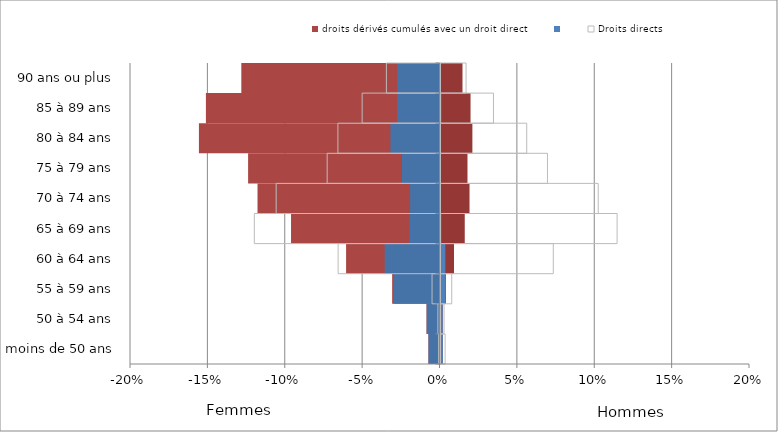
| Category | droits dérivés cumulés avec un droit direct | Series 3 | Series 2 | Droits dérivés servis seuls | Series 5 | Droits directs |
|---|---|---|---|---|---|---|
|  moins de 50 ans | -0.007 | 0.002 | 0.002 | -0.007 | 0.003 | -0.001 |
|  50 à 54 ans | -0.008 | 0.001 | 0.001 | -0.008 | 0.002 | -0.001 |
|  55 à 59 ans | -0.031 | 0.004 | 0.003 | -0.03 | 0.007 | -0.005 |
|  60 à 64 ans | -0.06 | 0.009 | 0.003 | -0.035 | 0.073 | -0.066 |
|  65 à 69 ans | -0.096 | 0.016 | 0.001 | -0.019 | 0.114 | -0.12 |
|  70 à 74 ans | -0.118 | 0.019 | 0 | -0.019 | 0.102 | -0.106 |
|  75 à 79 ans | -0.124 | 0.017 | 0 | -0.024 | 0.069 | -0.073 |
|  80 à 84 ans | -0.155 | 0.021 | 0 | -0.032 | 0.056 | -0.066 |
|  85 à 89 ans | -0.151 | 0.019 | 0.001 | -0.027 | 0.034 | -0.05 |
|  90 ans ou plus | -0.128 | 0.014 | 0 | -0.027 | 0.017 | -0.035 |